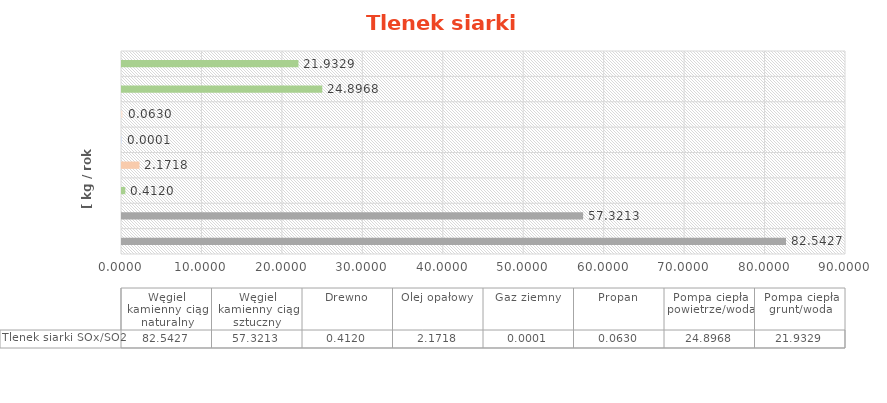
| Category | Tlenek siarki |
|---|---|
| Węgiel kamienny ciąg naturalny | 82.543 |
| Węgiel kamienny ciąg sztuczny | 57.321 |
| Drewno | 0.412 |
| Olej opałowy | 2.172 |
| Gaz ziemny | 0 |
| Propan | 0.063 |
| Pompa ciepła powietrze/woda | 24.897 |
| Pompa ciepła grunt/woda | 21.933 |